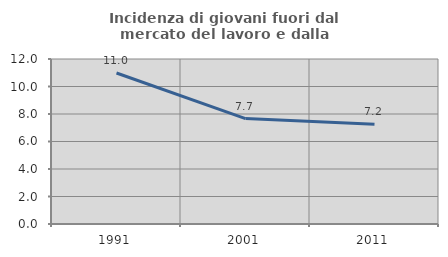
| Category | Incidenza di giovani fuori dal mercato del lavoro e dalla formazione  |
|---|---|
| 1991.0 | 10.981 |
| 2001.0 | 7.665 |
| 2011.0 | 7.249 |